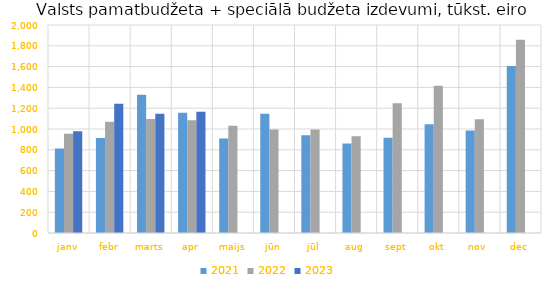
| Category | 2021 | 2022 | 2023 |
|---|---|---|---|
| janv | 812540.784 | 954604.585 | 979490.845 |
| febr | 913452.191 | 1070533.109 | 1241845.152 |
| marts | 1329058.335 | 1096177.665 | 1147758.348 |
| apr | 1156902.965 | 1085060.388 | 1165647.249 |
| maijs | 909621.75 | 1032376.247 | 0 |
| jūn | 1146703.878 | 994027.105 | 0 |
| jūl | 939467.851 | 994781.699 | 0 |
| aug | 860719.856 | 929865.805 | 0 |
| sept | 915890.517 | 1247630.19 | 0 |
| okt | 1045656.477 | 1415572.01 | 0 |
| nov | 984919.983 | 1092974.61 | 0 |
| dec | 1605011.589 | 1857192.044 | 0 |